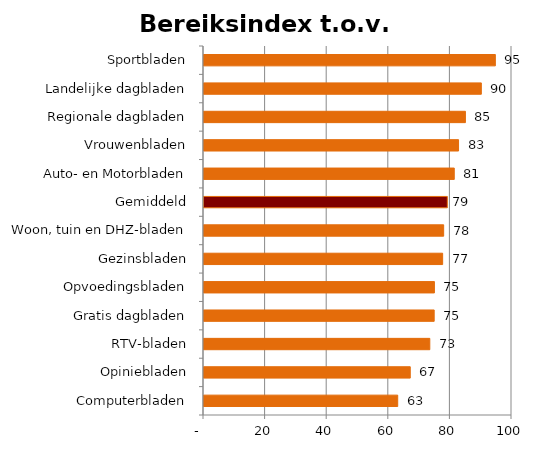
| Category | Index |
|---|---|
| Computerbladen | 62.893 |
| Opiniebladen | 66.964 |
| RTV-bladen | 73.315 |
| Gratis dagbladen | 74.733 |
| Opvoedingsbladen | 74.809 |
| Gezinsbladen | 77.481 |
| Woon, tuin en DHZ-bladen | 77.813 |
| Gemiddeld | 79 |
| Auto- en Motorbladen | 81.25 |
| Vrouwenbladen | 82.646 |
| Regionale dagbladen | 84.876 |
| Landelijke dagbladen | 90.043 |
| Sportbladen | 94.595 |